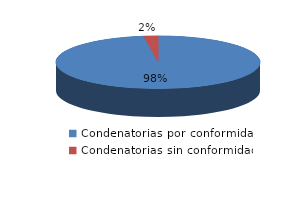
| Category | Series 0 |
|---|---|
| 0 | 43 |
| 1 | 1 |